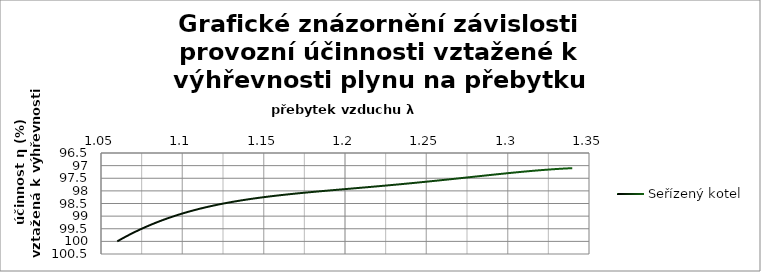
| Category | seřízený |
|---|---|
| 1.06 | 100 |
| 1.15 | 98.2 |
| 1.24 | 97.7 |
| 1.3 | 97.3 |
| 1.34 | 97.1 |
| 1.15 | 98.3 |